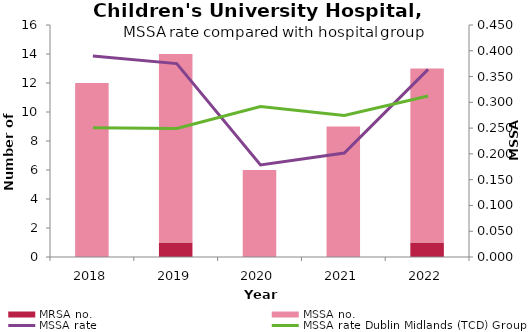
| Category | MRSA no. | MSSA no. |
|---|---|---|
| 2018.0 | 0 | 12 |
| 2019.0 | 1 | 13 |
| 2020.0 | 0 | 6 |
| 2021.0 | 0 | 9 |
| 2022.0 | 1 | 12 |